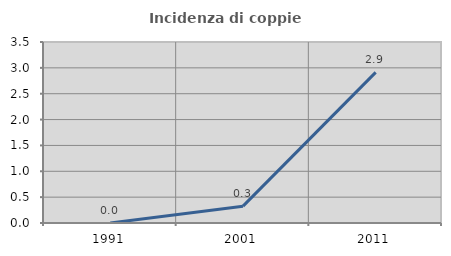
| Category | Incidenza di coppie miste |
|---|---|
| 1991.0 | 0 |
| 2001.0 | 0.326 |
| 2011.0 | 2.913 |